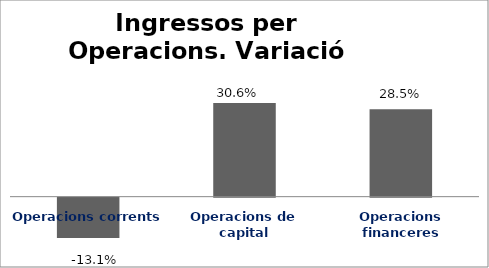
| Category | Series 0 |
|---|---|
| Operacions corrents | -0.131 |
| Operacions de capital | 0.306 |
| Operacions financeres | 0.285 |